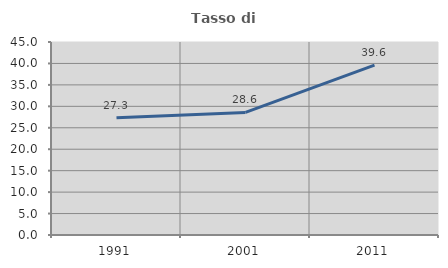
| Category | Tasso di occupazione   |
|---|---|
| 1991.0 | 27.329 |
| 2001.0 | 28.571 |
| 2011.0 | 39.597 |